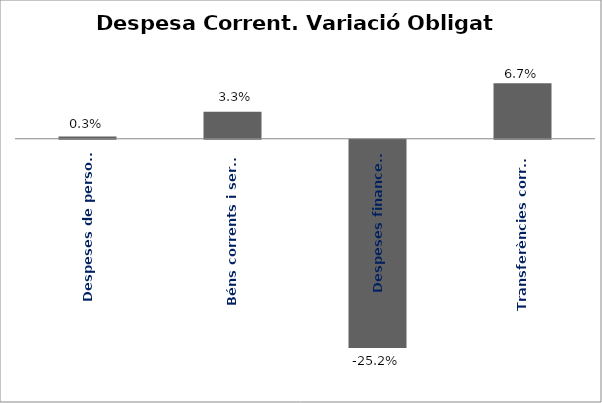
| Category | Series 0 |
|---|---|
| Despeses de personal | 0.003 |
| Béns corrents i serveis | 0.033 |
| Despeses financeres | -0.252 |
| Transferències corrents | 0.067 |